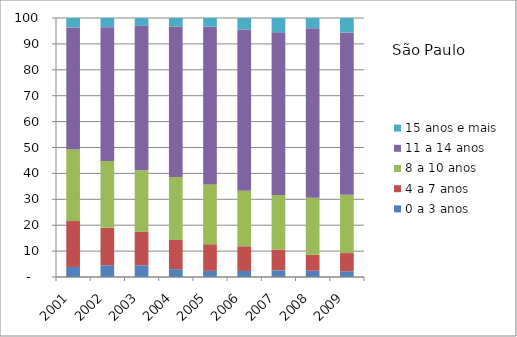
| Category | 0 a 3 anos | 4 a 7 anos | 8 a 10 anos | 11 a 14 anos | 15 anos e mais |
|---|---|---|---|---|---|
| 2001.0 | 3.88 | 17.73 | 27.6 | 47.15 | 3.64 |
| 2002.0 | 4.53 | 14.45 | 25.82 | 51.64 | 3.57 |
| 2003.0 | 4.47 | 12.94 | 23.79 | 55.76 | 3.04 |
| 2004.0 | 3.01 | 11.29 | 24.3 | 58.01 | 3.38 |
| 2005.0 | 2.37 | 10.28 | 23.11 | 60.87 | 3.37 |
| 2006.0 | 2.34 | 9.52 | 21.45 | 62.25 | 4.44 |
| 2007.0 | 2.57 | 7.91 | 21.21 | 62.77 | 5.53 |
| 2008.0 | 2.42 | 6.16 | 21.99 | 65.51 | 3.91 |
| 2009.0 | 2.2 | 7.04 | 22.5 | 62.69 | 5.57 |